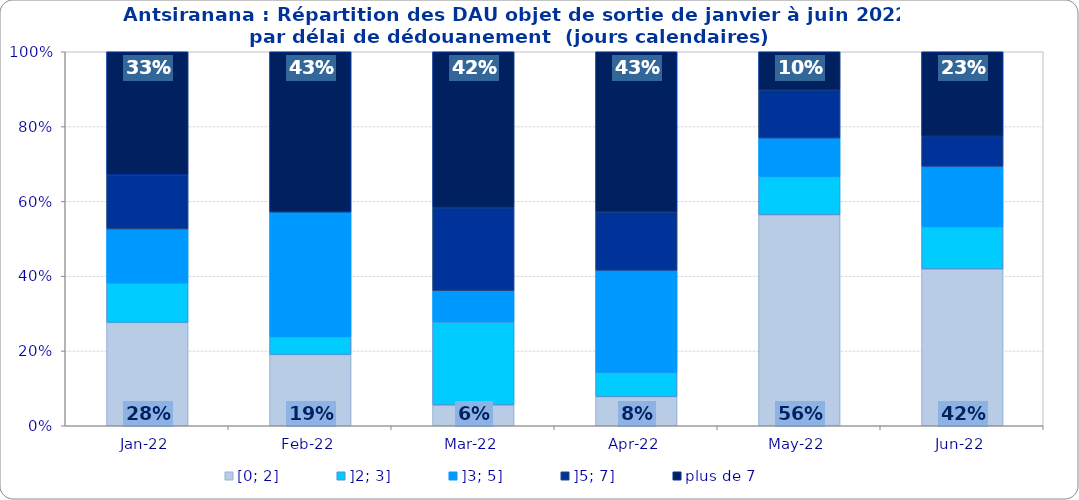
| Category | [0; 2] | ]2; 3] | ]3; 5] | ]5; 7] | plus de 7 |
|---|---|---|---|---|---|
| 2022-01-01 | 0.276 | 0.105 | 0.145 | 0.145 | 0.329 |
| 2022-02-01 | 0.19 | 0.048 | 0.333 | 0 | 0.429 |
| 2022-03-01 | 0.056 | 0.222 | 0.083 | 0.222 | 0.417 |
| 2022-04-01 | 0.078 | 0.065 | 0.273 | 0.156 | 0.429 |
| 2022-05-01 | 0.564 | 0.103 | 0.103 | 0.128 | 0.103 |
| 2022-06-01 | 0.419 | 0.113 | 0.161 | 0.081 | 0.226 |